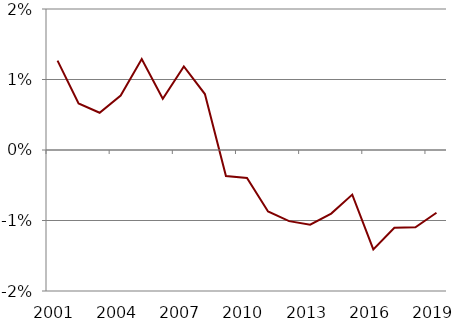
| Category | Series 0 |
|---|---|
| 2001.0 | 0.013 |
| 2002.0 | 0.007 |
| 2003.0 | 0.005 |
| 2004.0 | 0.008 |
| 2005.0 | 0.013 |
| 2006.0 | 0.007 |
| 2007.0 | 0.012 |
| 2008.0 | 0.008 |
| 2009.0 | -0.004 |
| 2010.0 | -0.004 |
| 2011.0 | -0.009 |
| 2012.0 | -0.01 |
| 2013.0 | -0.011 |
| 2014.0 | -0.009 |
| 2015.0 | -0.006 |
| 2016.0 | -0.014 |
| 2017.0 | -0.011 |
| 2018.0 | -0.011 |
| 2019.0 | -0.009 |